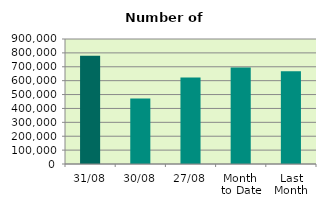
| Category | Series 0 |
|---|---|
| 31/08 | 778556 |
| 30/08 | 472380 |
| 27/08 | 622526 |
| Month 
to Date | 695004.455 |
| Last
Month | 667427.091 |